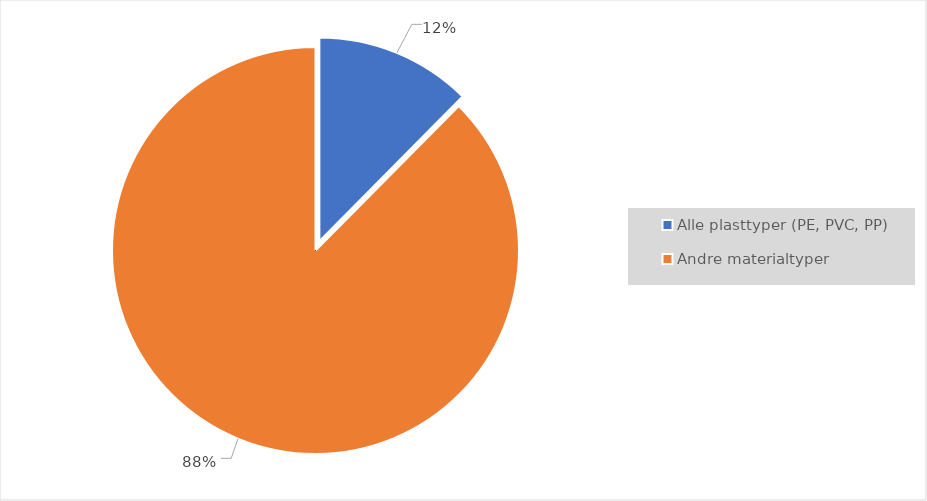
| Category | Series 0 |
|---|---|
| Alle plasttyper (PE, PVC, PP) | 0.124 |
| Andre materialtyper | 0.876 |